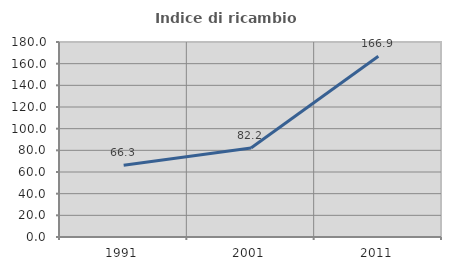
| Category | Indice di ricambio occupazionale  |
|---|---|
| 1991.0 | 66.327 |
| 2001.0 | 82.212 |
| 2011.0 | 166.867 |